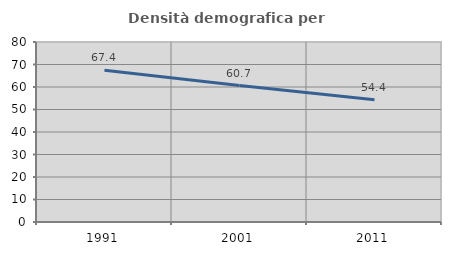
| Category | Densità demografica |
|---|---|
| 1991.0 | 67.403 |
| 2001.0 | 60.663 |
| 2011.0 | 54.355 |